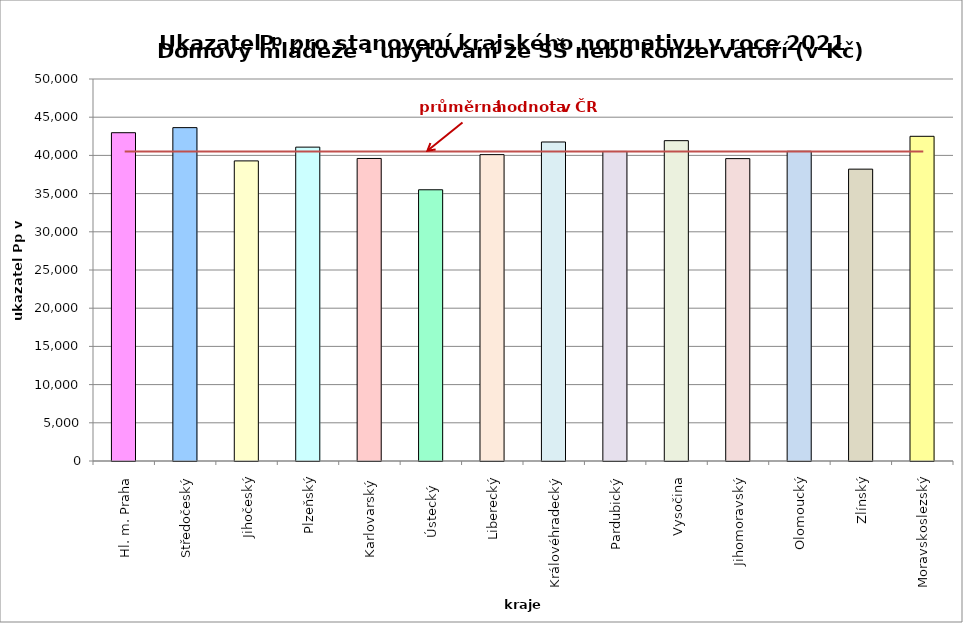
| Category | Series 0 |
|---|---|
| Hl. m. Praha | 42970 |
| Středočeský | 43634 |
| Jihočeský | 39280 |
| Plzeňský | 41083 |
| Karlovarský  | 39600 |
| Ústecký   | 35501 |
| Liberecký | 40100 |
| Královéhradecký | 41755 |
| Pardubický | 40517 |
| Vysočina | 41929 |
| Jihomoravský | 39578 |
| Olomoucký | 40538 |
| Zlínský | 38200 |
| Moravskoslezský | 42500 |